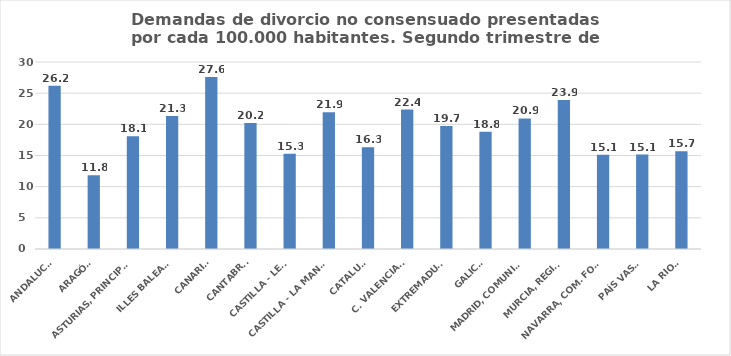
| Category | Series 0 |
|---|---|
| ANDALUCÍA | 26.196 |
| ARAGÓN | 11.846 |
| ASTURIAS, PRINCIPADO | 18.091 |
| ILLES BALEARS | 21.325 |
| CANARIAS | 27.586 |
| CANTABRIA | 20.195 |
| CASTILLA - LEÓN | 15.286 |
| CASTILLA - LA MANCHA | 21.926 |
| CATALUÑA | 16.308 |
| C. VALENCIANA | 22.379 |
| EXTREMADURA | 19.74 |
| GALICIA | 18.818 |
| MADRID, COMUNIDAD | 20.947 |
| MURCIA, REGIÓN | 23.914 |
| NAVARRA, COM. FORAL | 15.128 |
| PAÍS VASCO | 15.141 |
| LA RIOJA | 15.663 |